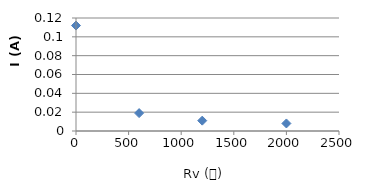
| Category | Series 0 |
|---|---|
| 0.0 | 0.112 |
| 600.0 | 0.019 |
| 1200.0 | 0.011 |
| 2000.0 | 0.008 |